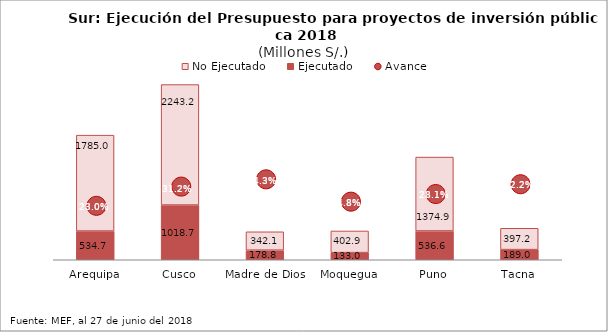
| Category | Ejecutado | No Ejecutado |
|---|---|---|
| Arequipa | 534.669 | 1784.968 |
| Cusco | 1018.708 | 2243.229 |
| Madre de Dios | 178.832 | 342.128 |
| Moquegua | 133.035 | 402.91 |
| Puno | 536.604 | 1374.94 |
| Tacna | 188.981 | 397.206 |